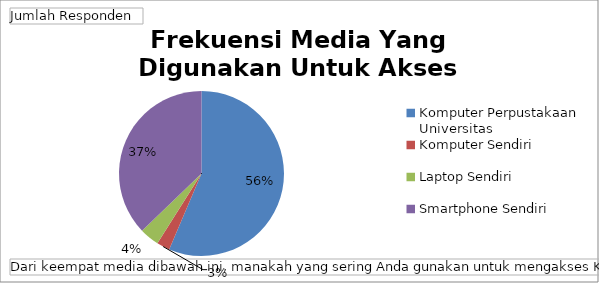
| Category | Total |
|---|---|
| Komputer Perpustakaan Universitas | 44 |
| Komputer Sendiri | 2 |
| Laptop Sendiri | 3 |
| Smartphone Sendiri | 29 |